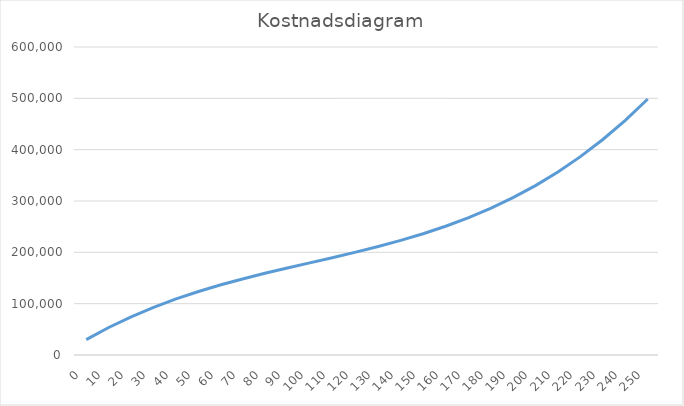
| Category | Totale kostnader |
|---|---|
| 0.0 | 30000 |
| 10.0 | 53550 |
| 20.0 | 74400 |
| 30.0 | 92850 |
| 40.0 | 109200 |
| 50.0 | 123750 |
| 60.0 | 136800 |
| 70.0 | 148650 |
| 80.0 | 159600 |
| 90.0 | 169950 |
| 100.0 | 180000 |
| 110.0 | 190050 |
| 120.0 | 200400 |
| 130.0 | 211350 |
| 140.0 | 223200 |
| 150.0 | 236250 |
| 160.0 | 250800 |
| 170.0 | 267150 |
| 180.0 | 285600 |
| 190.0 | 306450 |
| 200.0 | 330000 |
| 210.0 | 356550 |
| 220.0 | 386400 |
| 230.0 | 419850 |
| 240.0 | 457200 |
| 250.0 | 498750 |